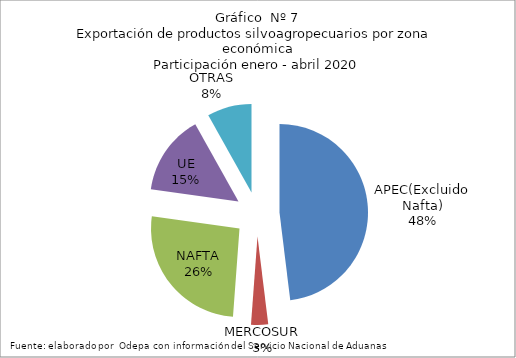
| Category | Series 0 |
|---|---|
| APEC(Excluido Nafta) | 2810803.419 |
| MERCOSUR | 182110.585 |
| NAFTA | 1523715.225 |
| UE | 856883.63 |
| OTRAS | 474966.142 |